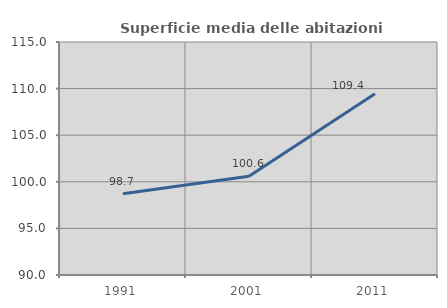
| Category | Superficie media delle abitazioni occupate |
|---|---|
| 1991.0 | 98.709 |
| 2001.0 | 100.597 |
| 2011.0 | 109.446 |